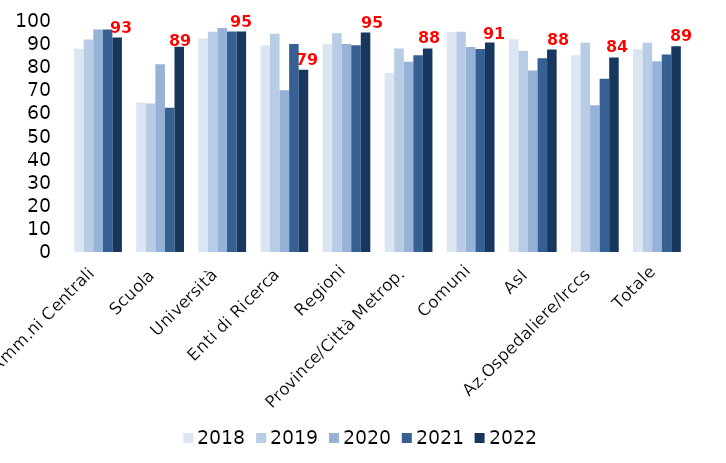
| Category | 2018 | 2019 | 2020 | 2021 | 2022 |
|---|---|---|---|---|---|
| Amm.ni Centrali | 88 | 92 | 96.296 | 96.296 | 92.857 |
| Scuola | 64.706 | 64.286 | 81.25 | 62.5 | 88.889 |
| Università | 92.424 | 95.385 | 96.923 | 95.455 | 95.455 |
| Enti di Ricerca | 89.474 | 94.444 | 70 | 90 | 78.947 |
| Regioni | 90 | 94.737 | 90 | 89.474 | 95 |
| Province/Città Metrop. | 77.451 | 88.119 | 82.353 | 85.149 | 88.119 |
| Comuni | 95.283 | 95.327 | 88.785 | 87.85 | 90.654 |
| Asl | 92.079 | 87 | 78.571 | 83.838 | 87.629 |
| Az.Ospedaliere/Irccs | 85.135 | 90.541 | 63.514 | 75 | 84.211 |
| Totale | 87.736 | 90.631 | 82.609 | 85.499 | 89.098 |